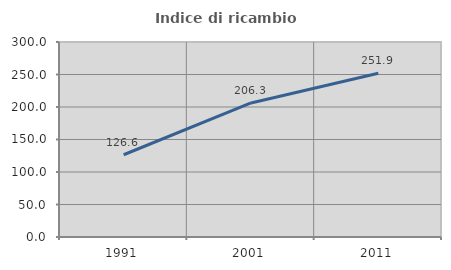
| Category | Indice di ricambio occupazionale  |
|---|---|
| 1991.0 | 126.551 |
| 2001.0 | 206.25 |
| 2011.0 | 251.862 |